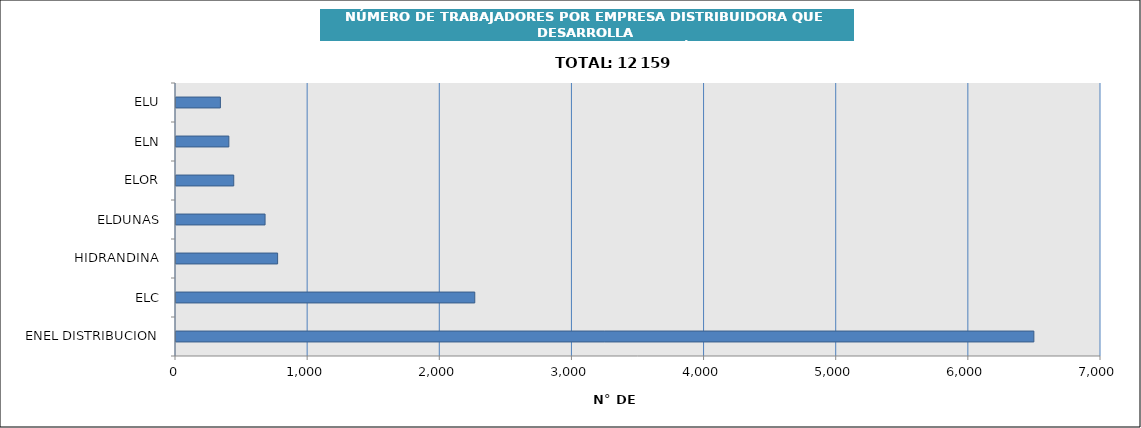
| Category | Series 0 |
|---|---|
| ENEL DISTRIBUCION | 6492 |
| ELC | 2261 |
| HIDRANDINA | 769 |
| ELDUNAS | 674 |
| ELOR | 437 |
| ELN | 400 |
| ELU | 336 |